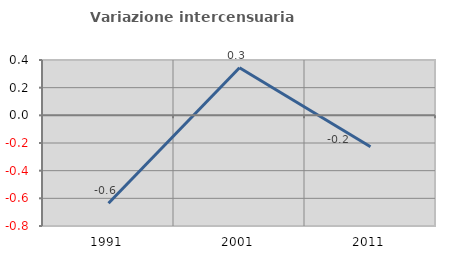
| Category | Variazione intercensuaria annua |
|---|---|
| 1991.0 | -0.636 |
| 2001.0 | 0.343 |
| 2011.0 | -0.227 |